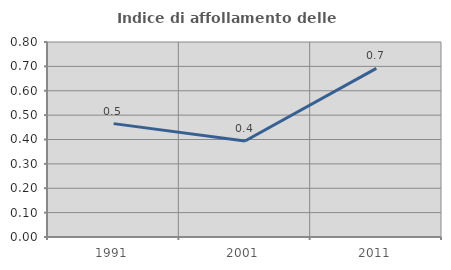
| Category | Indice di affollamento delle abitazioni  |
|---|---|
| 1991.0 | 0.465 |
| 2001.0 | 0.394 |
| 2011.0 | 0.692 |